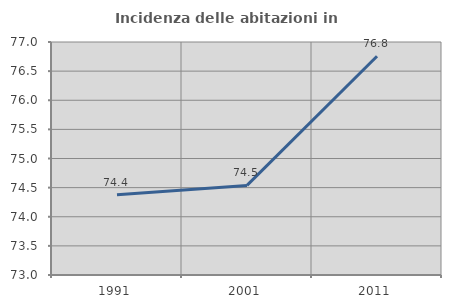
| Category | Incidenza delle abitazioni in proprietà  |
|---|---|
| 1991.0 | 74.38 |
| 2001.0 | 74.538 |
| 2011.0 | 76.755 |